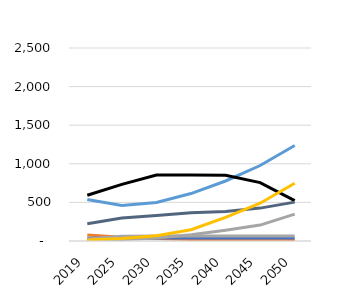
| Category | liquids | natural gas | coal | nuclear | hydro | other | wind | solar |
|---|---|---|---|---|---|---|---|---|
| 2019.0 | 77.92 | 538.19 | 593.2 | 37.21 | 224.79 | 26.84 | 9.54 | 11.95 |
| 2025.0 | 47.72 | 459.26 | 733.49 | 37.27 | 296.98 | 61.18 | 19.18 | 32.03 |
| 2030.0 | 31.63 | 499.23 | 855.41 | 37.27 | 330.64 | 65.65 | 38.65 | 68.19 |
| 2035.0 | 20.73 | 614.32 | 855.41 | 37.27 | 364.35 | 65.8 | 81.87 | 146.33 |
| 2040.0 | 13.36 | 777.33 | 851.47 | 37.27 | 383.21 | 65.89 | 140.08 | 306.72 |
| 2045.0 | 8.36 | 977.95 | 757.03 | 37.27 | 425.99 | 65.97 | 206.32 | 489.69 |
| 2050.0 | 4.97 | 1237.38 | 523.98 | 37.27 | 503.74 | 66.04 | 348.96 | 748.44 |